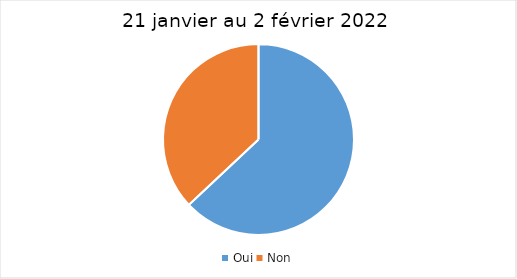
| Category | 21 janvier au 2 février 2022 |
|---|---|
| Oui | 63 |
| Non | 37 |